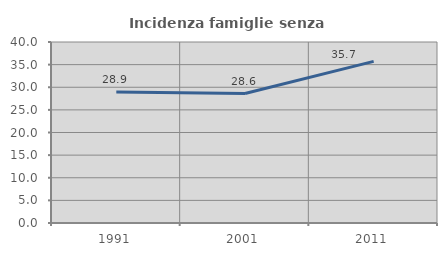
| Category | Incidenza famiglie senza nuclei |
|---|---|
| 1991.0 | 28.94 |
| 2001.0 | 28.615 |
| 2011.0 | 35.714 |